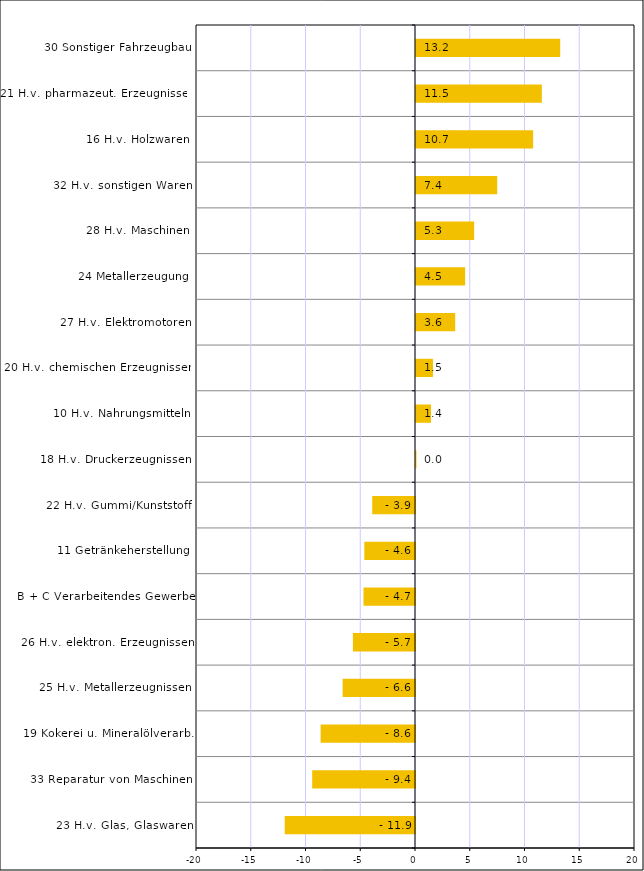
| Category | Series 0 |
|---|---|
| 23 H.v. Glas, Glaswaren | -11.898 |
| 33 Reparatur von Maschinen | -9.388 |
| 19 Kokerei u. Mineralölverarb. | -8.619 |
| 25 H.v. Metallerzeugnissen | -6.609 |
| 26 H.v. elektron. Erzeugnissen | -5.669 |
| B + C Verarbeitendes Gewerbe | -4.703 |
| 11 Getränkeherstellung | -4.628 |
| 22 H.v. Gummi/Kunststoff | -3.908 |
| 18 H.v. Druckerzeugnissen | 0.04 |
| 10 H.v. Nahrungsmitteln | 1.372 |
| 20 H.v. chemischen Erzeugnissen | 1.55 |
| 27 H.v. Elektromotoren | 3.58 |
| 24 Metallerzeugung | 4.488 |
| 28 H.v. Maschinen | 5.31 |
| 32 H.v. sonstigen Waren | 7.419 |
| 16 H.v. Holzwaren | 10.696 |
| 21 H.v. pharmazeut. Erzeugnissen | 11.491 |
| 30 Sonstiger Fahrzeugbau | 13.169 |